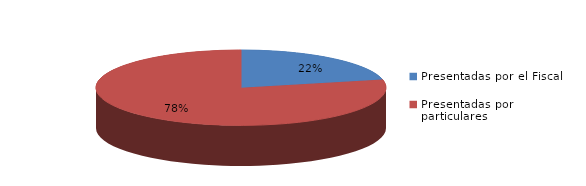
| Category | Series 0 |
|---|---|
| Presentadas por el Fiscal | 34 |
| Presentadas por particulares | 124 |